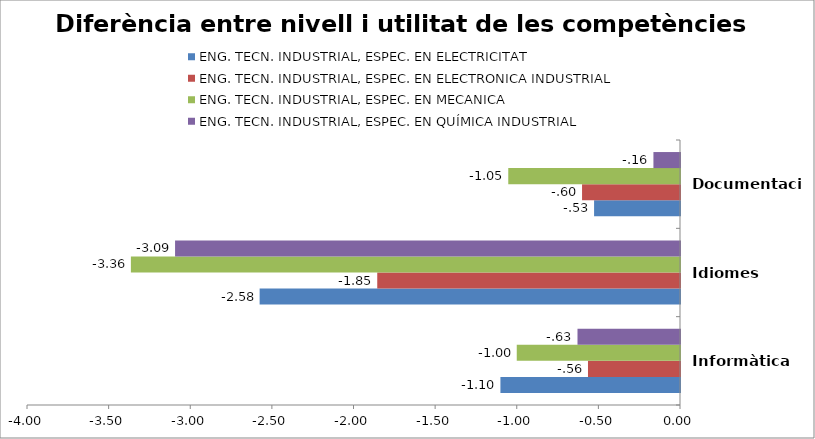
| Category | ENG. TECN. INDUSTRIAL, ESPEC. EN ELECTRICITAT | ENG. TECN. INDUSTRIAL, ESPEC. EN ELECTRONICA INDUSTRIAL | ENG. TECN. INDUSTRIAL, ESPEC. EN MECANICA | ENG. TECN. INDUSTRIAL, ESPEC. EN QUÍMICA INDUSTRIAL |
|---|---|---|---|---|
| Informàtica | -1.1 | -0.564 | -1 | -0.628 |
| Idiomes | -2.575 | -1.855 | -3.364 | -3.093 |
| Documentació | -0.526 | -0.6 | -1.052 | -0.163 |